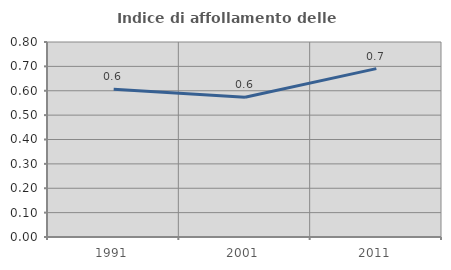
| Category | Indice di affollamento delle abitazioni  |
|---|---|
| 1991.0 | 0.606 |
| 2001.0 | 0.574 |
| 2011.0 | 0.691 |